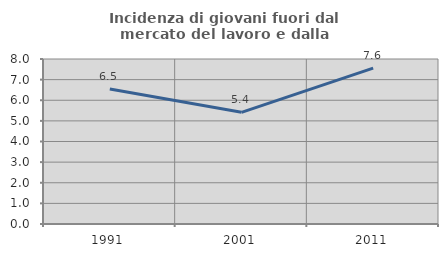
| Category | Incidenza di giovani fuori dal mercato del lavoro e dalla formazione  |
|---|---|
| 1991.0 | 6.545 |
| 2001.0 | 5.416 |
| 2011.0 | 7.56 |